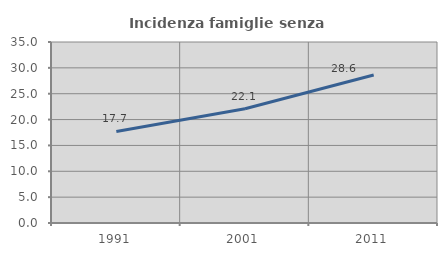
| Category | Incidenza famiglie senza nuclei |
|---|---|
| 1991.0 | 17.697 |
| 2001.0 | 22.093 |
| 2011.0 | 28.607 |